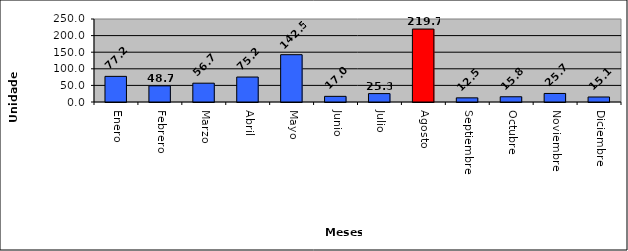
| Category | controladas |
|---|---|
| Enero | 77.2 |
| Febrero | 48.7 |
| Marzo | 56.7 |
| Abril | 75.2 |
| Mayo | 142.5 |
| Junio | 17 |
| Julio | 25.3 |
| Agosto | 219.7 |
| Septiembre | 12.5 |
| Octubre | 15.8 |
| Noviembre | 25.7 |
| Diciembre | 15.1 |